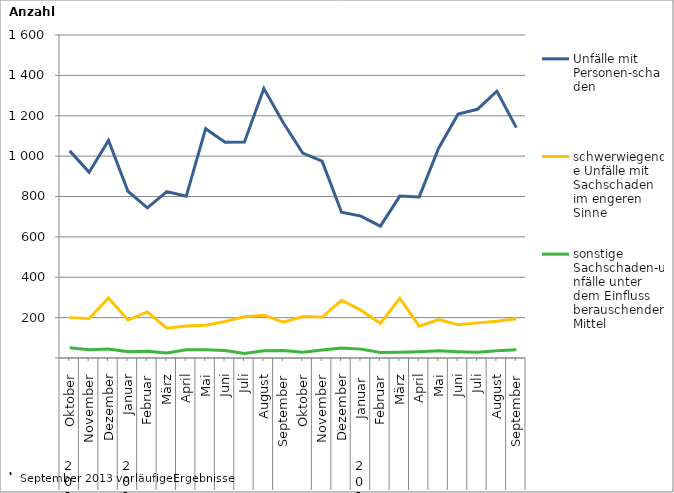
| Category | Unfälle mit Personen-schaden | schwerwiegende Unfälle mit Sachschaden   im engeren Sinne | sonstige Sachschaden-unfälle unter dem Einfluss berauschender Mittel |
|---|---|---|---|
| 0 | 1026 | 200 | 51 |
| 1 | 920 | 196 | 41 |
| 2 | 1078 | 297 | 45 |
| 3 | 826 | 188 | 31 |
| 4 | 744 | 228 | 34 |
| 5 | 824 | 148 | 25 |
| 6 | 801 | 159 | 41 |
| 7 | 1136 | 162 | 41 |
| 8 | 1069 | 181 | 37 |
| 9 | 1070 | 204 | 22 |
| 10 | 1335 | 212 | 36 |
| 11 | 1165 | 177 | 37 |
| 12 | 1015 | 205 | 28 |
| 13 | 975 | 203 | 40 |
| 14 | 722 | 286 | 50 |
| 15 | 703 | 237 | 44 |
| 16 | 653 | 171 | 27 |
| 17 | 802 | 296 | 28 |
| 18 | 798 | 158 | 31 |
| 19 | 1039 | 190 | 36 |
| 20 | 1208 | 165 | 31 |
| 21 | 1232 | 174 | 28 |
| 22 | 1322 | 182 | 36 |
| 23 | 1141 | 194 | 41 |